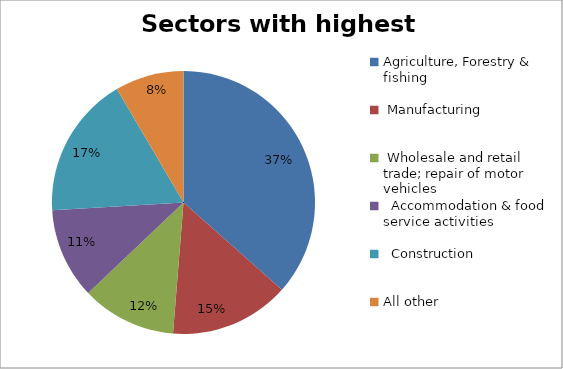
| Category | Sectors with highest totals | Percentage |
|---|---|---|
| Agriculture, Forestry & fishing | 36111 | 0.366 |
|  Manufacturing | 14543 | 0.147 |
|  Wholesale and retail trade; repair of motor vehicles  | 11495 | 0.116 |
|   Accommodation & food service activities | 11003 | 0.111 |
|   Construction | 17289 | 0.175 |
| All other | 8351 | 0.085 |